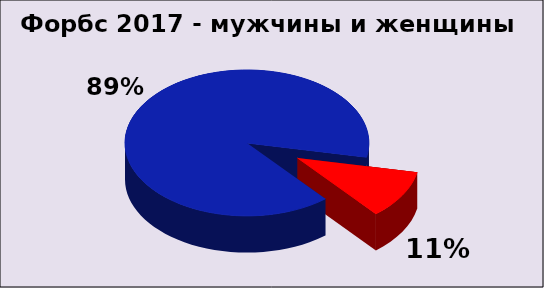
| Category | Series 0 |
|---|---|
| Мужчины | 1641 |
| Женщины | 198 |